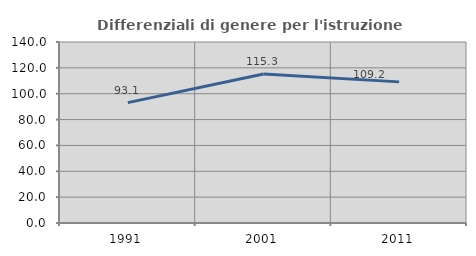
| Category | Differenziali di genere per l'istruzione superiore |
|---|---|
| 1991.0 | 93.085 |
| 2001.0 | 115.3 |
| 2011.0 | 109.156 |